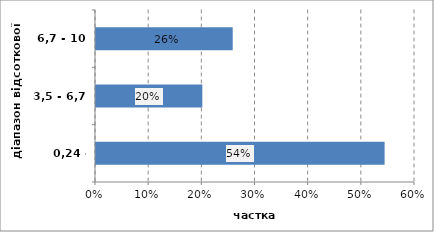
| Category | Series 0 |
|---|---|
| 0,24 - 3,5 | 0.543 |
| 3,5 - 6,7 | 0.2 |
| 6,7 - 10 | 0.257 |